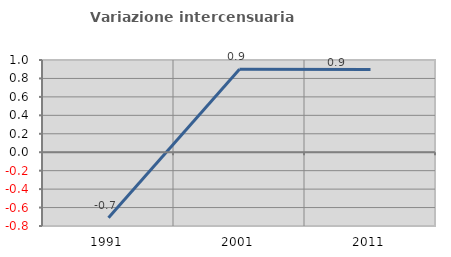
| Category | Variazione intercensuaria annua |
|---|---|
| 1991.0 | -0.71 |
| 2001.0 | 0.9 |
| 2011.0 | 0.898 |